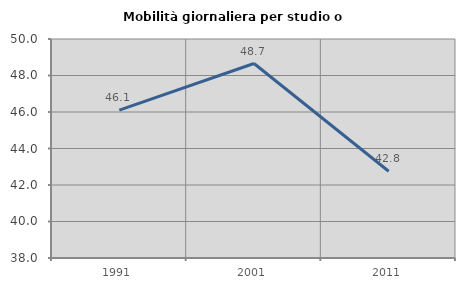
| Category | Mobilità giornaliera per studio o lavoro |
|---|---|
| 1991.0 | 46.105 |
| 2001.0 | 48.657 |
| 2011.0 | 42.751 |